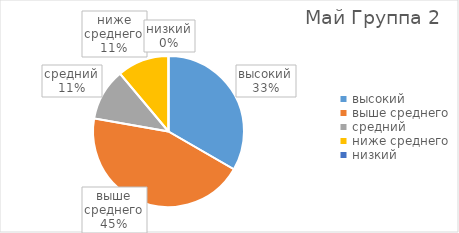
| Category | Series 0 |
|---|---|
| высокий | 3 |
| выше среднего | 4 |
| средний | 1 |
| ниже среднего | 1 |
| низкий | 0 |